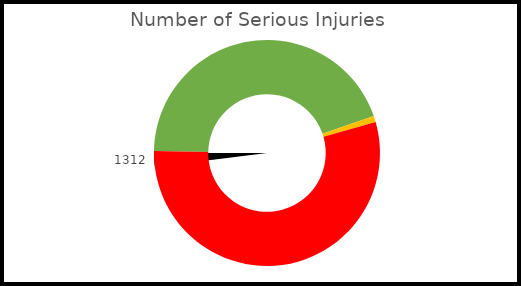
| Category | Pointer |
|---|---|
| 0 | 1312 |
| 1 | 26.24 |
| 2 | 1863.76 |